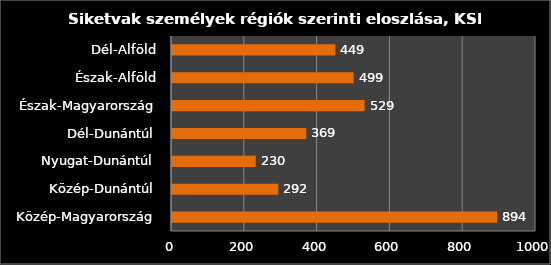
| Category | Series 0 |
|---|---|
|  Közép-Magyarország | 894 |
|   Közép-Dunántúl | 292 |
|   Nyugat-Dunántúl | 230 |
|   Dél-Dunántúl | 369 |
|   Észak-Magyarország | 529 |
|   Észak-Alföld | 499 |
|   Dél-Alföld | 449 |